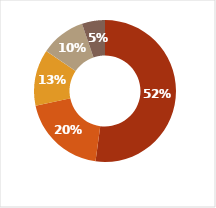
| Category | Series 0 |
|---|---|
| Транспорт | 0.521 |
| Жилье | 0.195 |
| Питание | 0.128 |
| Развлечения | 0.103 |
| Другое | 0.053 |